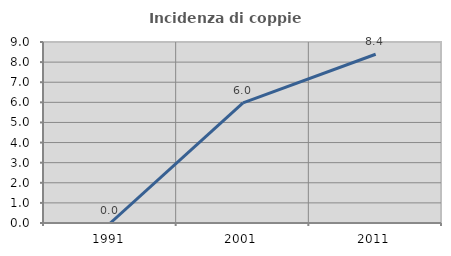
| Category | Incidenza di coppie miste |
|---|---|
| 1991.0 | 0 |
| 2001.0 | 5.97 |
| 2011.0 | 8.392 |